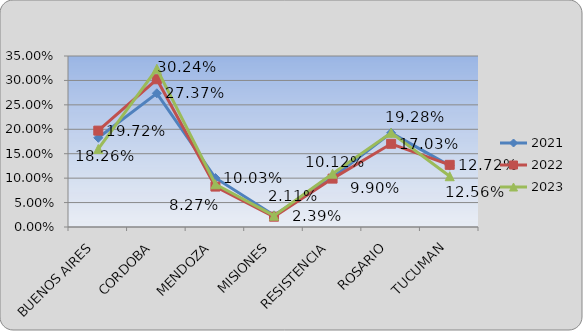
| Category | 2021 | 2022 | 2023 |
|---|---|---|---|
| BUENOS AIRES | 0.183 | 0.197 | 0.16 |
| CORDOBA | 0.274 | 0.302 | 0.324 |
| MENDOZA | 0.1 | 0.083 | 0.087 |
| MISIONES | 0.024 | 0.021 | 0.023 |
| RESISTENCIA | 0.101 | 0.099 | 0.109 |
| ROSARIO | 0.193 | 0.17 | 0.193 |
| TUCUMAN | 0.126 | 0.127 | 0.104 |